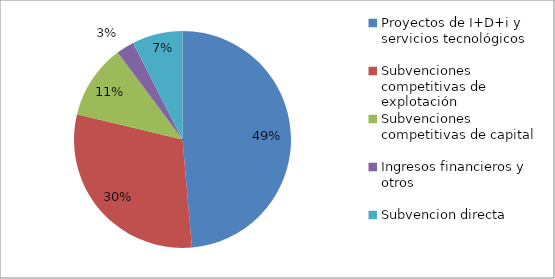
| Category | 2015 |
|---|---|
| Proyectos de I+D+i y servicios tecnológicos | 2018368 |
| Subvenciones competitivas de explotación | 1251222 |
| Subvenciones competitivas de capital | 458294.17 |
| Ingresos financieros y otros | 111527 |
| Subvencion directa | 312515.41 |